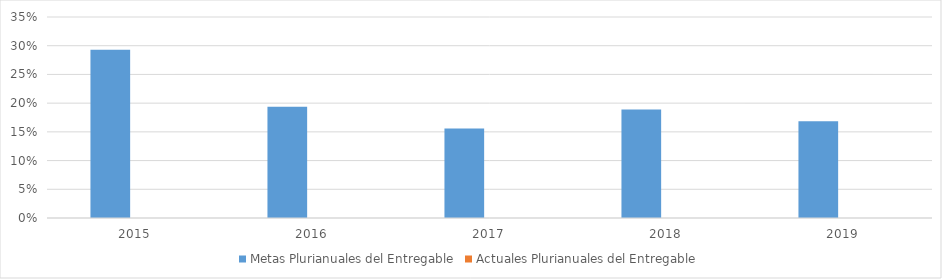
| Category | Metas Plurianuales del Entregable | Actuales Plurianuales del Entregable |
|---|---|---|
| 2015.0 | 0.293 | 0 |
| 2016.0 | 0.194 | 0 |
| 2017.0 | 0.156 | 0 |
| 2018.0 | 0.189 | 0 |
| 2019.0 | 0.168 | 0 |